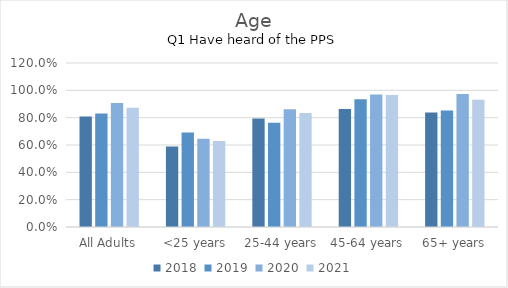
| Category | 2018 | 2019 | 2020 | 2021 |
|---|---|---|---|---|
| All Adults | 0.808 | 0.831 | 0.907 | 0.872 |
| <25 years | 0.589 | 0.691 | 0.646 | 0.629 |
| 25-44 years | 0.793 | 0.762 | 0.861 | 0.834 |
| 45-64 years | 0.863 | 0.934 | 0.97 | 0.966 |
| 65+ years | 0.837 | 0.853 | 0.973 | 0.931 |